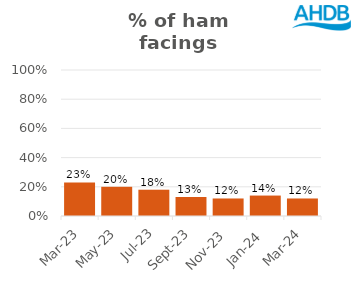
| Category | Ham |
|---|---|
| 2023-03-01 | 0.23 |
| 2023-05-01 | 0.2 |
| 2023-07-01 | 0.18 |
| 2023-09-01 | 0.13 |
| 2023-11-01 | 0.12 |
| 2024-01-01 | 0.14 |
| 2024-03-01 | 0.12 |